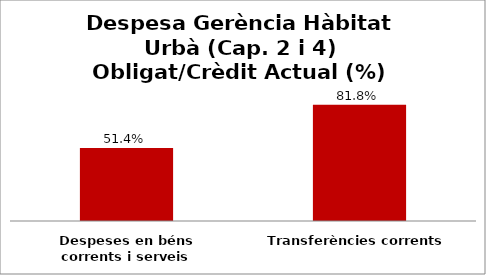
| Category | Series 0 |
|---|---|
| Despeses en béns corrents i serveis | 0.514 |
| Transferències corrents | 0.818 |